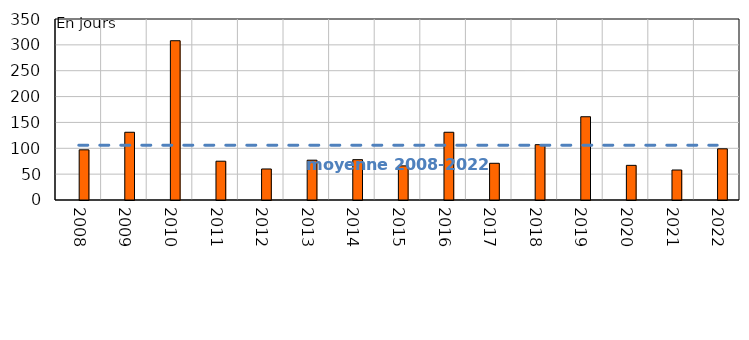
| Category | Nombre de journées individuelles non travaillées (JINT) pour fait de grève | Series 1 |
|---|---|---|
| 2008.0 |  | 97 |
| 2009.0 |  | 131 |
| 2010.0 |  | 308 |
| 2011.0 |  | 75 |
| 2012.0 |  | 60 |
| 2013.0 |  | 77 |
| 2014.0 |  | 78 |
| 2015.0 |  | 66 |
| 2016.0 |  | 131 |
| 2017.0 |  | 71 |
| 2018.0 |  | 107 |
| 2019.0 |  | 161 |
| 2020.0 |  | 67 |
| 2021.0 |  | 58 |
| 2022.0 |  | 99 |